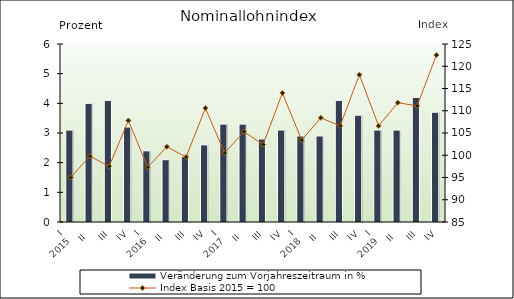
| Category | Veränderung zum Vorjahreszeitraum in % |
|---|---|
| 0 | 3.1 |
| 1 | 4 |
| 2 | 4.1 |
| 3 | 3.2 |
| 4 | 2.4 |
| 5 | 2.1 |
| 6 | 2.2 |
| 7 | 2.6 |
| 8 | 3.3 |
| 9 | 3.3 |
| 10 | 2.8 |
| 11 | 3.1 |
| 12 | 2.9 |
| 13 | 2.9 |
| 14 | 4.1 |
| 15 | 3.6 |
| 16 | 3.1 |
| 17 | 3.1 |
| 18 | 4.2 |
| 19 | 3.7 |